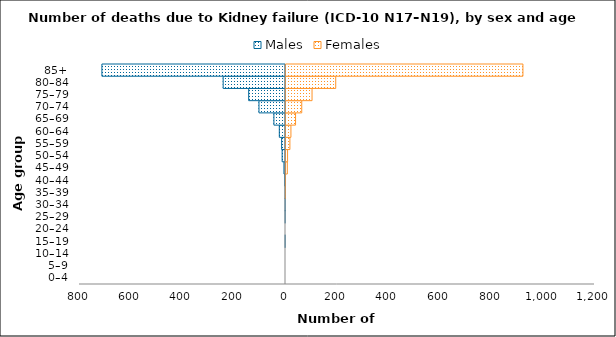
| Category | Males | Females |
|---|---|---|
| 0–4 | 0 | 0 |
| 5–9 | 0 | 0 |
| 10–14 | 0 | 0 |
| 15–19 | -1 | 0 |
| 20–24 | 0 | 0 |
| 25–29 | -1 | 0 |
| 30–34 | -1 | 0 |
| 35–39 | -1 | 1 |
| 40–44 | -2 | 2 |
| 45–49 | -6 | 9 |
| 50–54 | -13 | 10 |
| 55–59 | -15 | 19 |
| 60–64 | -24 | 23 |
| 65–69 | -45 | 41 |
| 70–74 | -103 | 65 |
| 75–79 | -143 | 105 |
| 80–84 | -242 | 197 |
| 85+ | -713 | 924 |